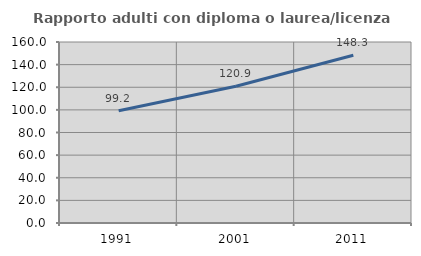
| Category | Rapporto adulti con diploma o laurea/licenza media  |
|---|---|
| 1991.0 | 99.176 |
| 2001.0 | 120.927 |
| 2011.0 | 148.258 |